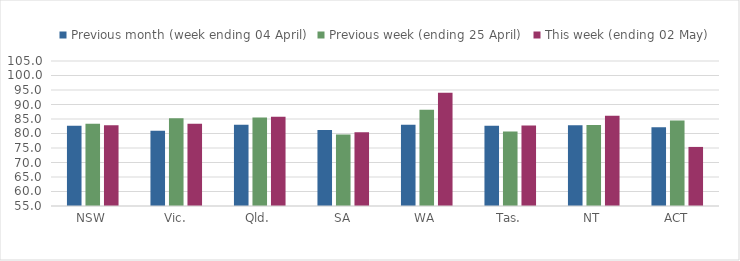
| Category | Previous month (week ending 04 April) | Previous week (ending 25 April) | This week (ending 02 May) |
|---|---|---|---|
| NSW | 82.699 | 83.341 | 82.876 |
| Vic. | 80.916 | 85.288 | 83.347 |
| Qld. | 83.002 | 85.526 | 85.788 |
| SA | 81.167 | 79.648 | 80.462 |
| WA | 83.05 | 88.148 | 94.049 |
| Tas. | 82.682 | 80.715 | 82.759 |
| NT | 82.876 | 82.958 | 86.148 |
| ACT | 82.159 | 84.468 | 75.371 |